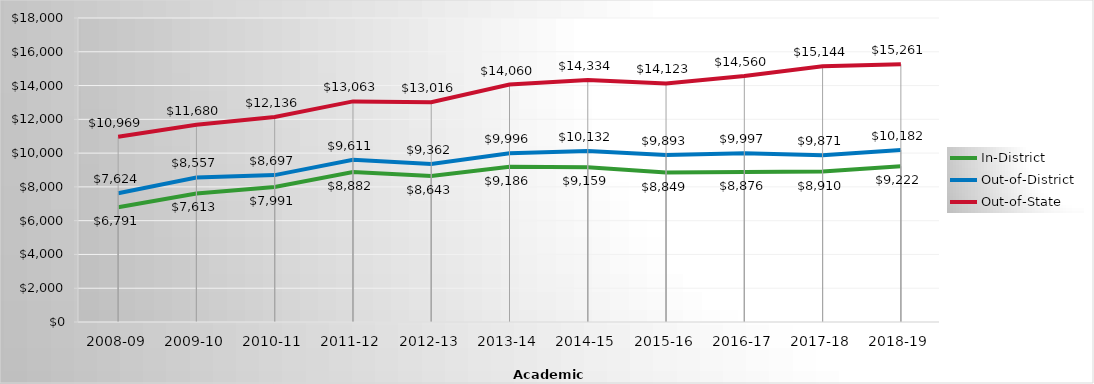
| Category | In-District | Out-of-District | Out-of-State |
|---|---|---|---|
| 2008-09 | 6791 | 7624 | 10969 |
| 2009-10 | 7613 | 8557 | 11680 |
| 2010-11 | 7991 | 8697 | 12136 |
| 2011-12 | 8882 | 9611 | 13063 |
| 2012-13 | 8643.15 | 9362 | 13016 |
| 2013-14 | 9185.83 | 9996.06 | 14060.13 |
| 2014-15 | 9159.04 | 10132.13 | 14333.65 |
| 2015-16 | 8849 | 9893 | 14123 |
| 2016-17 | 8876 | 9997 | 14560 |
| 2017-18 | 8910 | 9871 | 15144 |
| 2018-19 | 9222 | 10182 | 15261 |